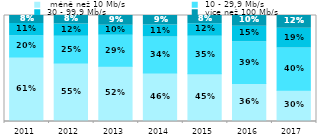
| Category |   méně než 10 Mb/s |  10 - 29,9 Mb/s |  30 - 99,9 Mb/s |  více než 100 Mb/s  |
|---|---|---|---|---|
| 2011.0 | 0.608 | 0.202 | 0.114 | 0.076 |
| 2012.0 | 0.552 | 0.252 | 0.115 | 0.081 |
| 2013.0 | 0.522 | 0.291 | 0.095 | 0.092 |
| 2014.0 | 0.458 | 0.338 | 0.114 | 0.09 |
| 2015.0 | 0.451 | 0.353 | 0.119 | 0.077 |
| 2016.0 | 0.359 | 0.393 | 0.147 | 0.101 |
| 2017.0 | 0.295 | 0.399 | 0.185 | 0.121 |